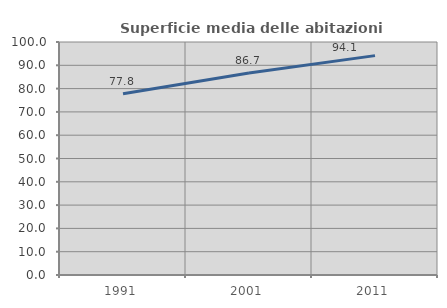
| Category | Superficie media delle abitazioni occupate |
|---|---|
| 1991.0 | 77.776 |
| 2001.0 | 86.682 |
| 2011.0 | 94.149 |